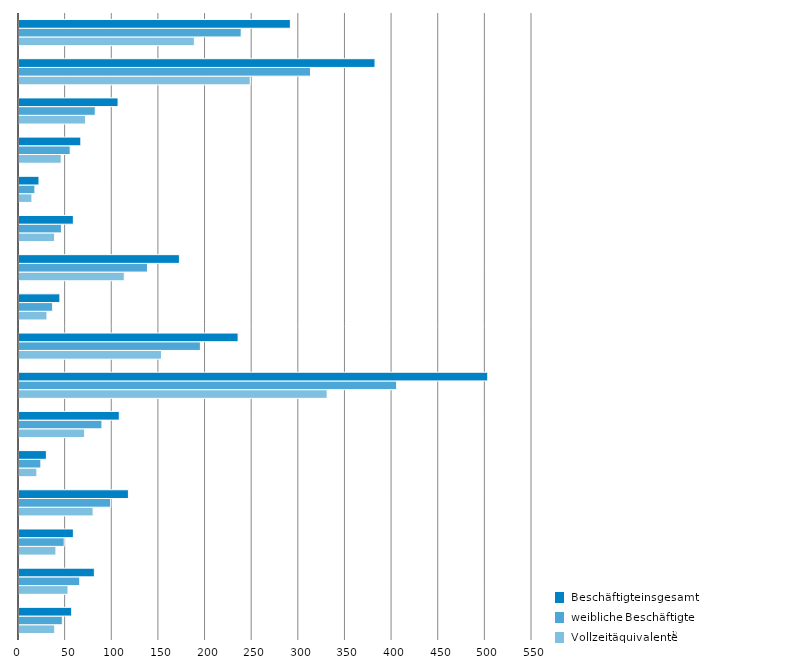
| Category | VZÄ | wB | iB |
|---|---|---|---|
| 0 | 38.336 | 46.465 | 56.488 |
| 1 | 52.555 | 65.15 | 80.784 |
| 2 | 39.595 | 48.441 | 58.31 |
| 3 | 79.456 | 98.349 | 117.321 |
| 4 | 19.148 | 23.44 | 29.349 |
| 5 | 70.36 | 88.916 | 107.546 |
| 6 | 330.391 | 404.925 | 502.588 |
| 7 | 152.732 | 194.482 | 234.925 |
| 8 | 29.971 | 36.101 | 43.847 |
| 9 | 112.884 | 137.749 | 171.975 |
| 10 | 38.148 | 45.526 | 58.264 |
| 11 | 13.862 | 17.069 | 21.425 |
| 12 | 45.293 | 54.883 | 66.295 |
| 13 | 71.363 | 81.741 | 106.234 |
| 14 | 247.927 | 312.537 | 381.703 |
| 15 | 187.979 | 238.225 | 290.947 |